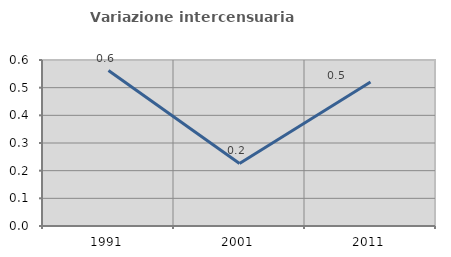
| Category | Variazione intercensuaria annua |
|---|---|
| 1991.0 | 0.562 |
| 2001.0 | 0.226 |
| 2011.0 | 0.52 |